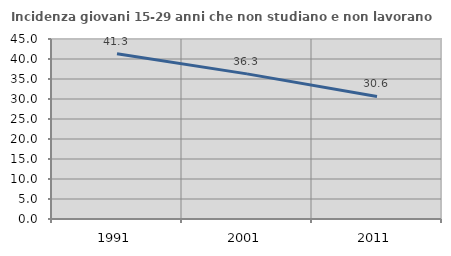
| Category | Incidenza giovani 15-29 anni che non studiano e non lavorano  |
|---|---|
| 1991.0 | 41.294 |
| 2001.0 | 36.277 |
| 2011.0 | 30.643 |